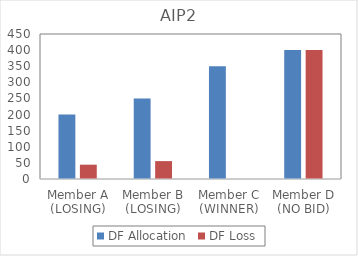
| Category | DF Allocation | DF Loss |
|---|---|---|
| Member A (LOSING) | 200 | 44.444 |
| Member B (LOSING) | 250 | 55.556 |
| Member C (WINNER) | 350 | 0 |
| Member D (NO BID) | 400 | 400 |